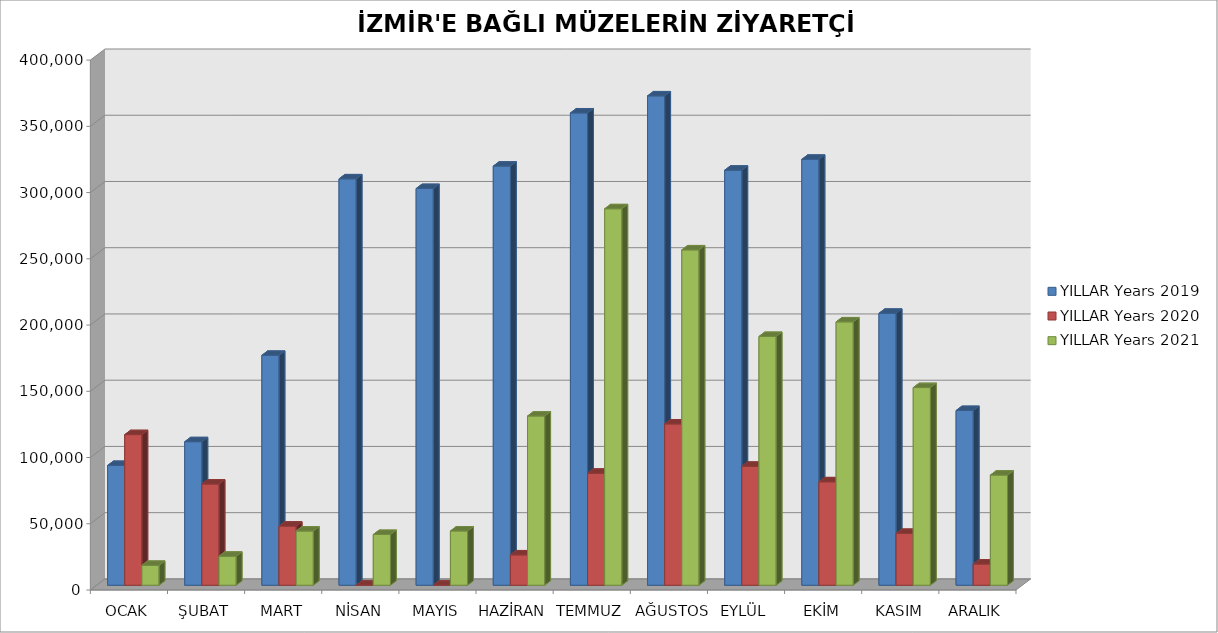
| Category | YILLAR |
|---|---|
| OCAK | 14992 |
| ŞUBAT | 21877 |
| MART | 40903 |
| NİSAN | 38306 |
| MAYIS | 40946 |
| HAZİRAN | 127729 |
| TEMMUZ | 284174 |
| AĞUSTOS | 253129 |
| EYLÜL | 187775 |
| EKİM | 198786 |
| KASIM | 149190 |
| ARALIK | 83118 |